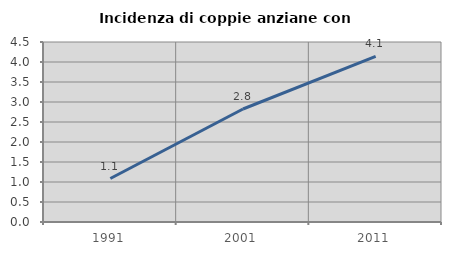
| Category | Incidenza di coppie anziane con figli |
|---|---|
| 1991.0 | 1.087 |
| 2001.0 | 2.825 |
| 2011.0 | 4.142 |